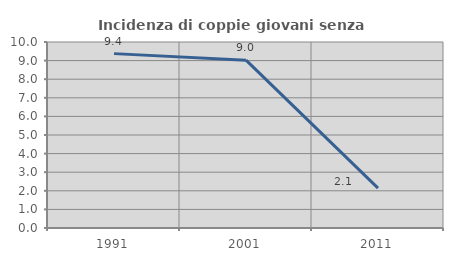
| Category | Incidenza di coppie giovani senza figli |
|---|---|
| 1991.0 | 9.375 |
| 2001.0 | 9.023 |
| 2011.0 | 2.143 |